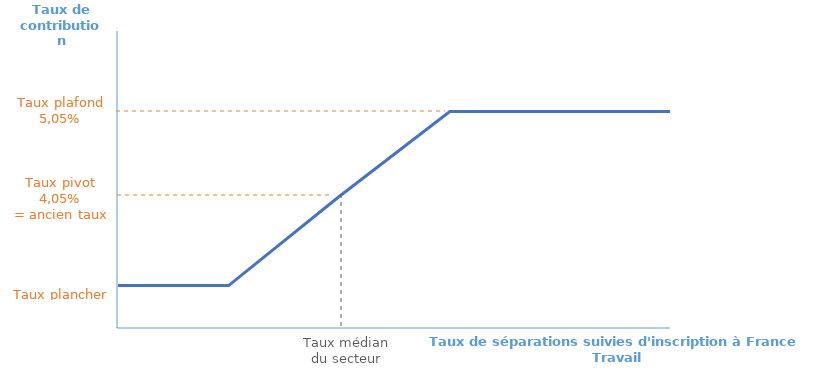
| Category | Taux de contribution  |
|---|---|
| 0.0 | 0.03 |
| 0.05616438356164386 | 0.03 |
| 0.2 | 0.04 |
| 0.336986301369863 | 0.05 |
| 0.4 | 0.05 |
| 0.5 | 0.05 |